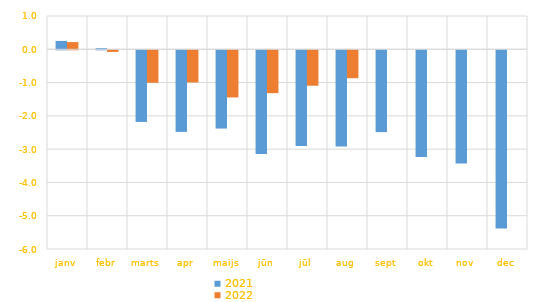
| Category | 2021 | 2022 |
|---|---|---|
| janv | 0.252 | 0.217 |
| febr | 0.033 | -0.049 |
| marts | -2.153 | -0.976 |
| apr | -2.452 | -0.966 |
| maijs | -2.351 | -1.417 |
| jūn | -3.12 | -1.288 |
| jūl | -2.876 | -1.065 |
| aug | -2.888 | -0.839 |
| sept | -2.459 | 0 |
| okt | -3.209 | 0 |
| nov | -3.398 | 0 |
| dec | -5.356 | 0 |